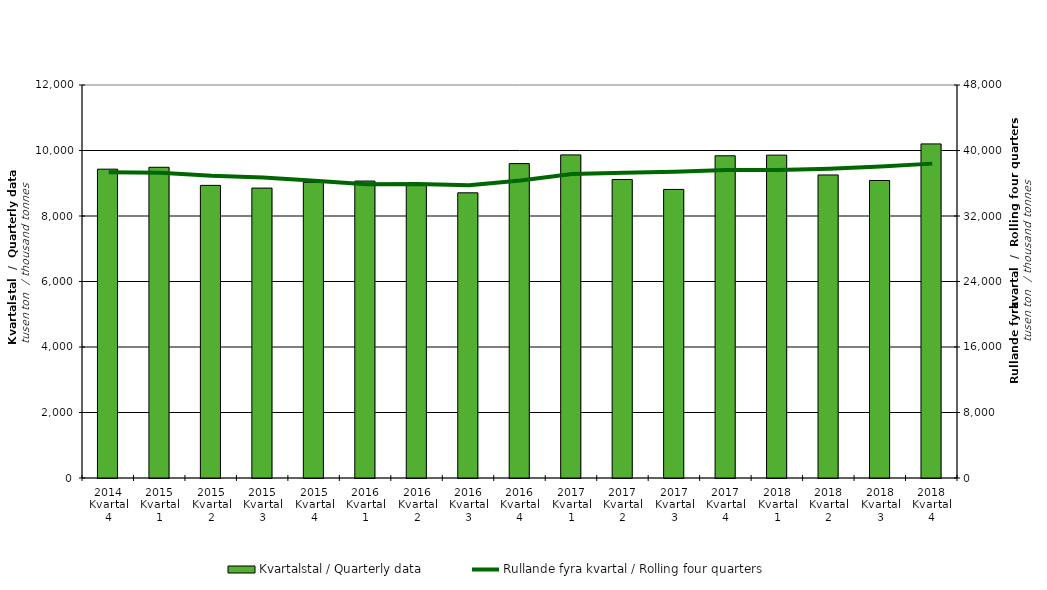
| Category | Kvartalstal / Quarterly data |
|---|---|
| 2014 Kvartal 4 | 9429.997 |
| 2015 Kvartal 1 | 9487.322 |
| 2015 Kvartal 2 | 8934.904 |
| 2015 Kvartal 3 | 8852.08 |
| 2015 Kvartal 4 | 9028.415 |
| 2016 Kvartal 1 | 9067.155 |
| 2016 Kvartal 2 | 8954.177 |
| 2016 Kvartal 3 | 8707.945 |
| 2016 Kvartal 4 | 9599.389 |
| 2017 Kvartal 1 | 9865.522 |
| 2017 Kvartal 2 | 9114.467 |
| 2017 Kvartal 3 | 8811.887 |
| 2017 Kvartal 4 | 9838.953 |
| 2018 Kvartal 1 | 9857.841 |
| 2018 Kvartal 2 | 9252.904 |
| 2018 Kvartal 3 | 9084.667 |
| 2018 Kvartal 4 | 10201.175 |